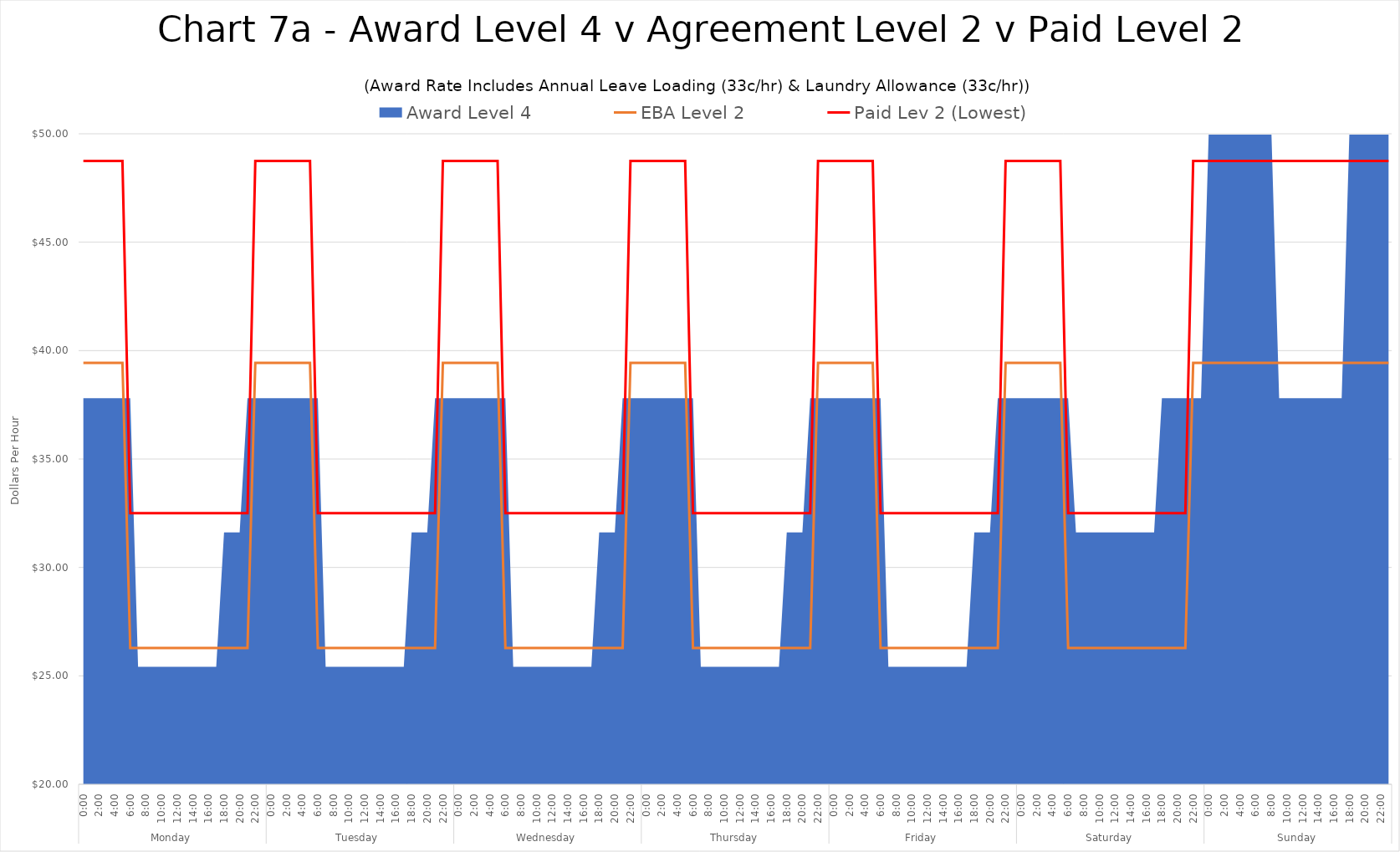
| Category | EBA Level 2 | Paid Lev 2 (Lowest) |
|---|---|---|
| 0 | 39.435 | 48.75 |
| 1 | 39.435 | 48.75 |
| 2 | 39.435 | 48.75 |
| 3 | 39.435 | 48.75 |
| 4 | 39.435 | 48.75 |
| 5 | 39.435 | 48.75 |
| 6 | 26.29 | 32.5 |
| 7 | 26.29 | 32.5 |
| 8 | 26.29 | 32.5 |
| 9 | 26.29 | 32.5 |
| 10 | 26.29 | 32.5 |
| 11 | 26.29 | 32.5 |
| 12 | 26.29 | 32.5 |
| 13 | 26.29 | 32.5 |
| 14 | 26.29 | 32.5 |
| 15 | 26.29 | 32.5 |
| 16 | 26.29 | 32.5 |
| 17 | 26.29 | 32.5 |
| 18 | 26.29 | 32.5 |
| 19 | 26.29 | 32.5 |
| 20 | 26.29 | 32.5 |
| 21 | 26.29 | 32.5 |
| 22 | 39.435 | 48.75 |
| 23 | 39.435 | 48.75 |
| 24 | 39.435 | 48.75 |
| 25 | 39.435 | 48.75 |
| 26 | 39.435 | 48.75 |
| 27 | 39.435 | 48.75 |
| 28 | 39.435 | 48.75 |
| 29 | 39.435 | 48.75 |
| 30 | 26.29 | 32.5 |
| 31 | 26.29 | 32.5 |
| 32 | 26.29 | 32.5 |
| 33 | 26.29 | 32.5 |
| 34 | 26.29 | 32.5 |
| 35 | 26.29 | 32.5 |
| 36 | 26.29 | 32.5 |
| 37 | 26.29 | 32.5 |
| 38 | 26.29 | 32.5 |
| 39 | 26.29 | 32.5 |
| 40 | 26.29 | 32.5 |
| 41 | 26.29 | 32.5 |
| 42 | 26.29 | 32.5 |
| 43 | 26.29 | 32.5 |
| 44 | 26.29 | 32.5 |
| 45 | 26.29 | 32.5 |
| 46 | 39.435 | 48.75 |
| 47 | 39.435 | 48.75 |
| 48 | 39.435 | 48.75 |
| 49 | 39.435 | 48.75 |
| 50 | 39.435 | 48.75 |
| 51 | 39.435 | 48.75 |
| 52 | 39.435 | 48.75 |
| 53 | 39.435 | 48.75 |
| 54 | 26.29 | 32.5 |
| 55 | 26.29 | 32.5 |
| 56 | 26.29 | 32.5 |
| 57 | 26.29 | 32.5 |
| 58 | 26.29 | 32.5 |
| 59 | 26.29 | 32.5 |
| 60 | 26.29 | 32.5 |
| 61 | 26.29 | 32.5 |
| 62 | 26.29 | 32.5 |
| 63 | 26.29 | 32.5 |
| 64 | 26.29 | 32.5 |
| 65 | 26.29 | 32.5 |
| 66 | 26.29 | 32.5 |
| 67 | 26.29 | 32.5 |
| 68 | 26.29 | 32.5 |
| 69 | 26.29 | 32.5 |
| 70 | 39.435 | 48.75 |
| 71 | 39.435 | 48.75 |
| 72 | 39.435 | 48.75 |
| 73 | 39.435 | 48.75 |
| 74 | 39.435 | 48.75 |
| 75 | 39.435 | 48.75 |
| 76 | 39.435 | 48.75 |
| 77 | 39.435 | 48.75 |
| 78 | 26.29 | 32.5 |
| 79 | 26.29 | 32.5 |
| 80 | 26.29 | 32.5 |
| 81 | 26.29 | 32.5 |
| 82 | 26.29 | 32.5 |
| 83 | 26.29 | 32.5 |
| 84 | 26.29 | 32.5 |
| 85 | 26.29 | 32.5 |
| 86 | 26.29 | 32.5 |
| 87 | 26.29 | 32.5 |
| 88 | 26.29 | 32.5 |
| 89 | 26.29 | 32.5 |
| 90 | 26.29 | 32.5 |
| 91 | 26.29 | 32.5 |
| 92 | 26.29 | 32.5 |
| 93 | 26.29 | 32.5 |
| 94 | 39.435 | 48.75 |
| 95 | 39.435 | 48.75 |
| 96 | 39.435 | 48.75 |
| 97 | 39.435 | 48.75 |
| 98 | 39.435 | 48.75 |
| 99 | 39.435 | 48.75 |
| 100 | 39.435 | 48.75 |
| 101 | 39.435 | 48.75 |
| 102 | 26.29 | 32.5 |
| 103 | 26.29 | 32.5 |
| 104 | 26.29 | 32.5 |
| 105 | 26.29 | 32.5 |
| 106 | 26.29 | 32.5 |
| 107 | 26.29 | 32.5 |
| 108 | 26.29 | 32.5 |
| 109 | 26.29 | 32.5 |
| 110 | 26.29 | 32.5 |
| 111 | 26.29 | 32.5 |
| 112 | 26.29 | 32.5 |
| 113 | 26.29 | 32.5 |
| 114 | 26.29 | 32.5 |
| 115 | 26.29 | 32.5 |
| 116 | 26.29 | 32.5 |
| 117 | 26.29 | 32.5 |
| 118 | 39.435 | 48.75 |
| 119 | 39.435 | 48.75 |
| 120 | 39.435 | 48.75 |
| 121 | 39.435 | 48.75 |
| 122 | 39.435 | 48.75 |
| 123 | 39.435 | 48.75 |
| 124 | 39.435 | 48.75 |
| 125 | 39.435 | 48.75 |
| 126 | 26.29 | 32.5 |
| 127 | 26.29 | 32.5 |
| 128 | 26.29 | 32.5 |
| 129 | 26.29 | 32.5 |
| 130 | 26.29 | 32.5 |
| 131 | 26.29 | 32.5 |
| 132 | 26.29 | 32.5 |
| 133 | 26.29 | 32.5 |
| 134 | 26.29 | 32.5 |
| 135 | 26.29 | 32.5 |
| 136 | 26.29 | 32.5 |
| 137 | 26.29 | 32.5 |
| 138 | 26.29 | 32.5 |
| 139 | 26.29 | 32.5 |
| 140 | 26.29 | 32.5 |
| 141 | 26.29 | 32.5 |
| 142 | 39.435 | 48.75 |
| 143 | 39.435 | 48.75 |
| 144 | 39.435 | 48.75 |
| 145 | 39.435 | 48.75 |
| 146 | 39.435 | 48.75 |
| 147 | 39.435 | 48.75 |
| 148 | 39.435 | 48.75 |
| 149 | 39.435 | 48.75 |
| 150 | 39.435 | 48.75 |
| 151 | 39.435 | 48.75 |
| 152 | 39.435 | 48.75 |
| 153 | 39.435 | 48.75 |
| 154 | 39.435 | 48.75 |
| 155 | 39.435 | 48.75 |
| 156 | 39.435 | 48.75 |
| 157 | 39.435 | 48.75 |
| 158 | 39.435 | 48.75 |
| 159 | 39.435 | 48.75 |
| 160 | 39.435 | 48.75 |
| 161 | 39.435 | 48.75 |
| 162 | 39.435 | 48.75 |
| 163 | 39.435 | 48.75 |
| 164 | 39.435 | 48.75 |
| 165 | 39.435 | 48.75 |
| 166 | 39.435 | 48.75 |
| 167 | 39.435 | 48.75 |